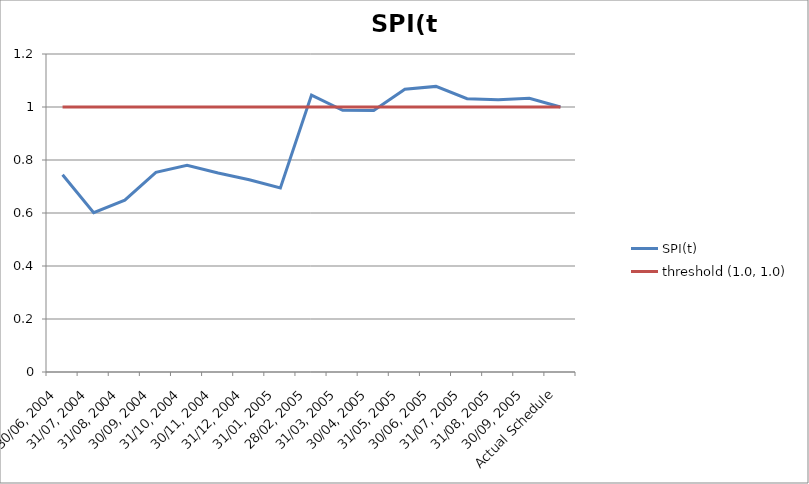
| Category | SPI(t) | threshold (1.0, 1.0) |
|---|---|---|
| 30/06, 2004 | 0.745 | 1 |
| 31/07, 2004 | 0.601 | 1 |
| 31/08, 2004 | 0.649 | 1 |
| 30/09, 2004 | 0.753 | 1 |
| 31/10, 2004 | 0.78 | 1 |
| 30/11, 2004 | 0.751 | 1 |
| 31/12, 2004 | 0.725 | 1 |
| 31/01, 2005 | 0.695 | 1 |
| 28/02, 2005 | 1.045 | 1 |
| 31/03, 2005 | 0.988 | 1 |
| 30/04, 2005 | 0.987 | 1 |
| 31/05, 2005 | 1.067 | 1 |
| 30/06, 2005 | 1.078 | 1 |
| 31/07, 2005 | 1.031 | 1 |
| 31/08, 2005 | 1.027 | 1 |
| 30/09, 2005 | 1.033 | 1 |
| Actual Schedule | 1 | 1 |